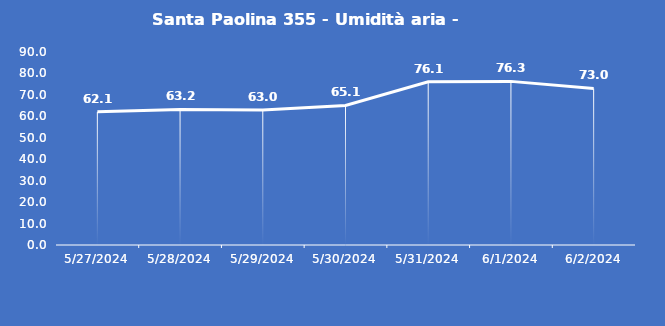
| Category | Santa Paolina 355 - Umidità aria - Grezzo (%) |
|---|---|
| 5/27/24 | 62.1 |
| 5/28/24 | 63.2 |
| 5/29/24 | 63 |
| 5/30/24 | 65.1 |
| 5/31/24 | 76.1 |
| 6/1/24 | 76.3 |
| 6/2/24 | 73 |